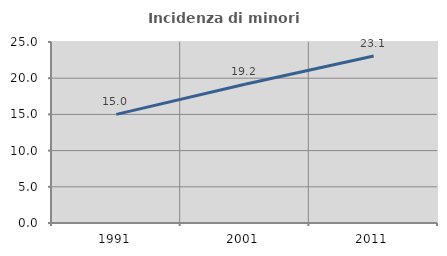
| Category | Incidenza di minori stranieri |
|---|---|
| 1991.0 | 15 |
| 2001.0 | 19.167 |
| 2011.0 | 23.067 |